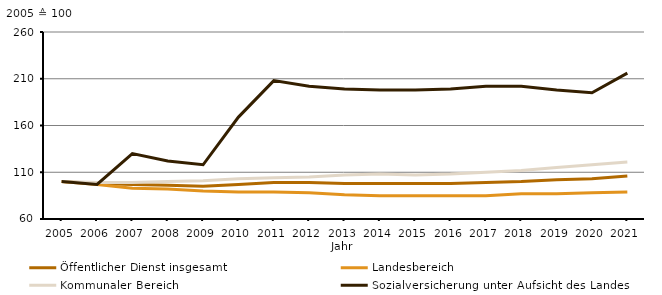
| Category | Öffentlicher Dienst insgesamt | Landesbereich | Kommunaler Bereich | Sozialversicherung unter Aufsicht des Landes |
|---|---|---|---|---|
| 2005.0 | 100 | 100 | 100 | 100 |
| 2006.0 | 98 | 97 | 99 | 97 |
| 2007.0 | 97 | 93 | 99 | 130 |
| 2008.0 | 96 | 92 | 100 | 122 |
| 2009.0 | 95 | 90 | 101 | 118 |
| 2010.0 | 97 | 89 | 103 | 169 |
| 2011.0 | 99 | 89 | 104 | 208 |
| 2012.0 | 99 | 88 | 105 | 202 |
| 2013.0 | 98 | 86 | 107 | 199 |
| 2014.0 | 98 | 85 | 108 | 198 |
| 2015.0 | 98 | 85 | 107 | 198 |
| 2016.0 | 98 | 85 | 108 | 199 |
| 2017.0 | 99 | 85 | 110 | 202 |
| 2018.0 | 100 | 87 | 112 | 202 |
| 2019.0 | 102 | 87 | 115 | 198 |
| 2020.0 | 103 | 88 | 118 | 195 |
| 2021.0 | 106 | 89 | 121 | 216 |